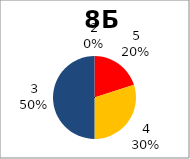
| Category | Series 0 |
|---|---|
| 5.0 | 2 |
| 4.0 | 3 |
| 3.0 | 5 |
| 2.0 | 0 |